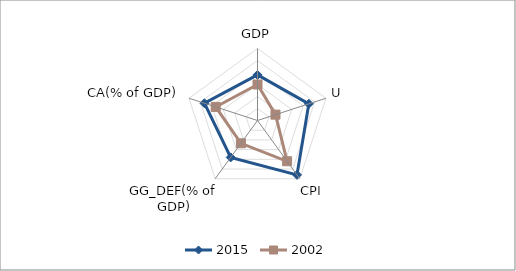
| Category | 2015 | 2002 |
|---|---|---|
| GDP | 7.6 | 6 |
| U | 8.996 | 3.151 |
| CPI | 11.2 | 8.4 |
| GG_DEF(% of GDP) | 7.6 | 4.695 |
| CA(% of GDP) | 9.3 | 7.328 |